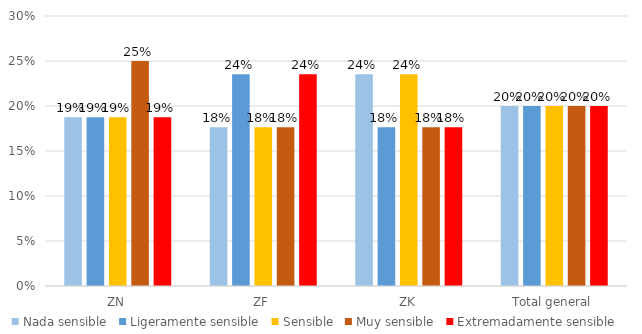
| Category | Nada sensible | Ligeramente sensible | Sensible | Muy sensible | Extremadamente sensible |
|---|---|---|---|---|---|
| ZN | 0.188 | 0.188 | 0.188 | 0.25 | 0.188 |
| ZF | 0.176 | 0.235 | 0.176 | 0.176 | 0.235 |
| ZK | 0.235 | 0.176 | 0.235 | 0.176 | 0.176 |
| Total general | 0.2 | 0.2 | 0.2 | 0.2 | 0.2 |